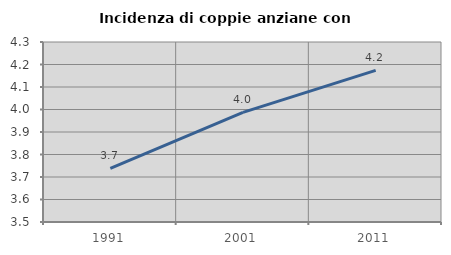
| Category | Incidenza di coppie anziane con figli |
|---|---|
| 1991.0 | 3.738 |
| 2001.0 | 3.988 |
| 2011.0 | 4.174 |